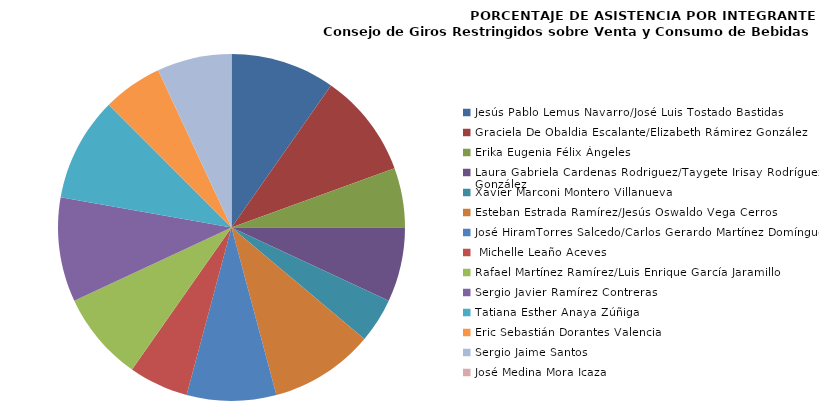
| Category | Series 0 |
|---|---|
| Jesús Pablo Lemus Navarro/José Luis Tostado Bastidas | 100 |
| Graciela De Obaldia Escalante/Elizabeth Rámirez González | 100 |
| Erika Eugenia Félix Ángeles | 57.143 |
| Laura Gabriela Cardenas Rodriguez/Taygete Irisay Rodríguez González | 71.429 |
| Xavier Marconi Montero Villanueva | 42.857 |
| Esteban Estrada Ramírez/Jesús Oswaldo Vega Cerros | 100 |
| José HiramTorres Salcedo/Carlos Gerardo Martínez Domínguez | 85.714 |
|  Michelle Leaño Aceves | 57.143 |
| Rafael Martínez Ramírez/Luis Enrique García Jaramillo | 85.714 |
| Sergio Javier Ramírez Contreras | 100 |
| Tatiana Esther Anaya Zúñiga | 100 |
| Eric Sebastián Dorantes Valencia | 57.143 |
| Sergio Jaime Santos | 71.429 |
| José Medina Mora Icaza | 0 |